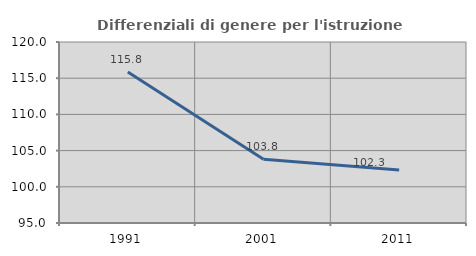
| Category | Differenziali di genere per l'istruzione superiore |
|---|---|
| 1991.0 | 115.843 |
| 2001.0 | 103.793 |
| 2011.0 | 102.326 |